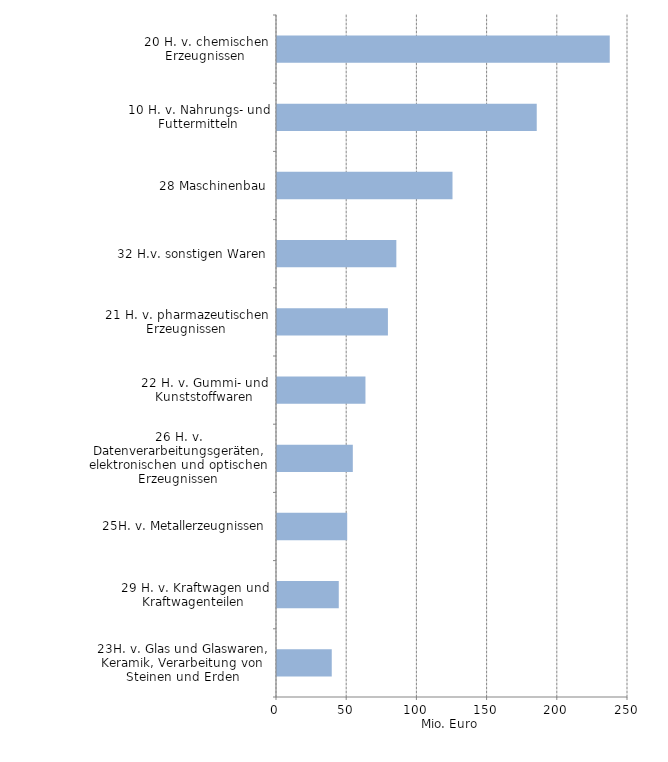
| Category | Series 0 |
|---|---|
| 23H. v. Glas und Glaswaren, Keramik, Verarbeitung von Steinen und Erden | 39 |
| 29 H. v. Kraftwagen und Kraftwagenteilen | 44 |
| 25H. v. Metallerzeugnissen | 50 |
| 26 H. v. Datenverarbeitungsgeräten, elektronischen und optischen Erzeugnissen | 54 |
| 22 H. v. Gummi- und Kunststoffwaren | 63 |
| 21 H. v. pharmazeutischen Erzeugnissen | 79 |
| 32 H.v. sonstigen Waren | 85 |
| 28 Maschinenbau | 125 |
| 10 H. v. Nahrungs- und Futtermitteln | 185 |
| 20 H. v. chemischen Erzeugnissen | 237 |